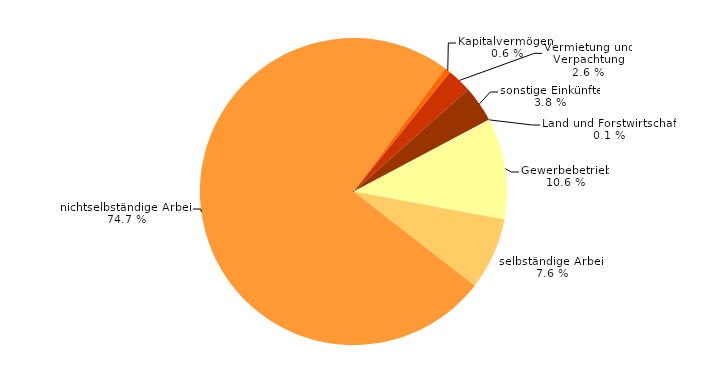
| Category | Series 0 |
|---|---|
| Land und Forstwirtschaft | 0.1 |
| Gewerbebetrieb | 10.6 |
| selbständige Arbeit | 7.6 |
| nichtselbständige Arbeit | 74.7 |
| Kapitalvermögen¹ | 0.6 |
| Vermietung und Verpachtung | 2.6 |
| sonstige Einkünfte | 3.8 |